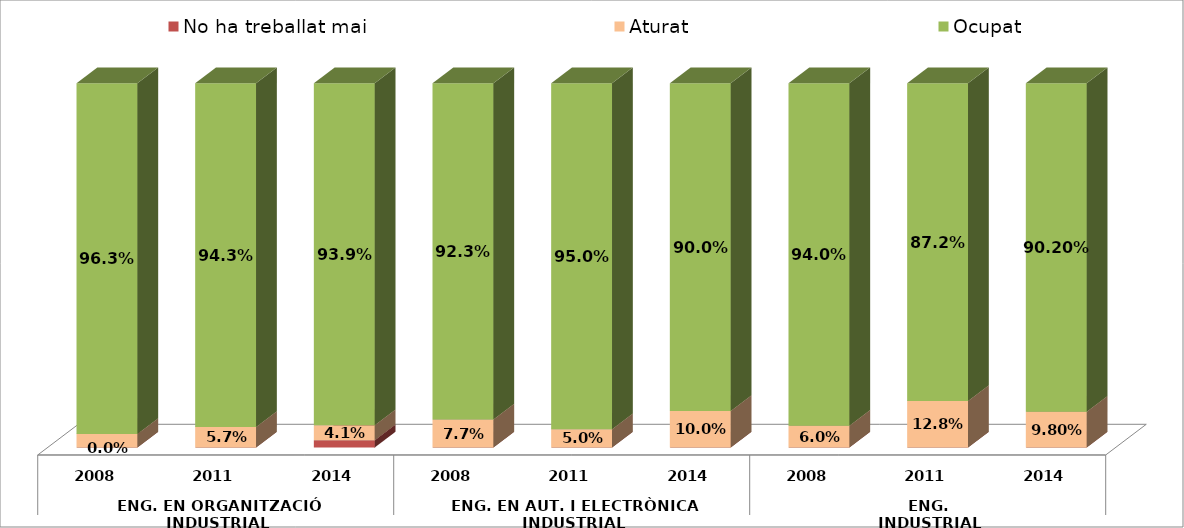
| Category | No ha treballat mai | Aturat | Ocupat |
|---|---|---|---|
| 0 | 0 | 0.037 | 0.963 |
| 1 | 0 | 0.057 | 0.943 |
| 2 | 0.02 | 0.041 | 0.939 |
| 3 | 0 | 0.077 | 0.923 |
| 4 | 0 | 0.05 | 0.95 |
| 5 | 0 | 0.1 | 0.9 |
| 6 | 0 | 0.06 | 0.94 |
| 7 | 0 | 0.128 | 0.872 |
| 8 | 0 | 0.098 | 0.902 |